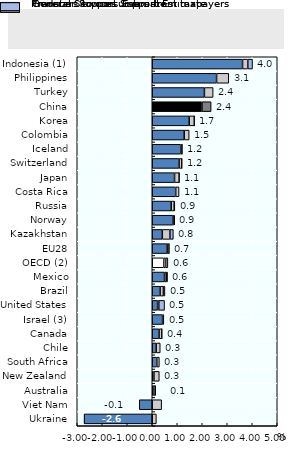
| Category | Producer Support Estimate | General Services Support Estimate | Transfers to consumers from taxpayers | TSEP |
|---|---|---|---|---|
| Ukraine | -2.724 | 0.164 | 0 | -2.56 |
| Viet Nam | -0.52 | 0.376 | 0 | -0.144 |
| Australia | 0.067 | 0.074 | 0 | 0.14 |
| New Zealand | 0.068 | 0.214 | 0 | 0.282 |
| South Africa | 0.182 | 0.102 | 0 | 0.284 |
| Chile | 0.158 | 0.163 | 0 | 0.32 |
| Canada | 0.274 | 0.113 | 0 | 0.388 |
| Israel (3) | 0.413 | 0.051 | 0 | 0.463 |
| United States | 0.214 | 0.048 | 0.23 | 0.492 |
| Brazil | 0.315 | 0.131 | 0.061 | 0.507 |
| Mexico | 0.49 | 0.071 | 0.053 | 0.614 |
| OECD (2) | 0.46 | 0.081 | 0.084 | 0.625 |
| EU28 | 0.596 | 0.075 | 0.007 | 0.678 |
| Kazakhstan | 0.403 | 0.304 | 0.137 | 0.844 |
| Norway | 0.831 | 0.043 | 0.021 | 0.895 |
| Russia | 0.759 | 0.119 | 0.025 | 0.903 |
| Costa Rica | 0.938 | 0.135 | 0 | 1.073 |
| Japan | 0.892 | 0.188 | 0 | 1.08 |
| Switzerland | 1.073 | 0.112 | 0.001 | 1.187 |
| Iceland | 1.141 | 0.052 | 0.003 | 1.196 |
| Colombia | 1.279 | 0.198 | 0 | 1.477 |
| Korea | 1.479 | 0.205 | 0.003 | 1.686 |
| China | 1.988 | 0.367 | 0 | 2.355 |
| Turkey | 2.087 | 0.349 | 0 | 2.435 |
| Philippines | 2.574 | 0.488 | 0 | 3.062 |
| Indonesia (1) | 3.612 | 0.209 | 0.19 | 4.011 |